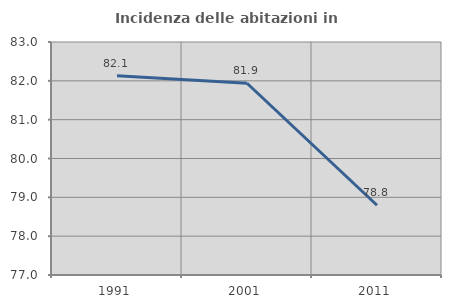
| Category | Incidenza delle abitazioni in proprietà  |
|---|---|
| 1991.0 | 82.133 |
| 2001.0 | 81.937 |
| 2011.0 | 78.796 |